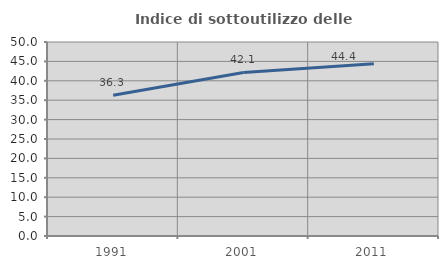
| Category | Indice di sottoutilizzo delle abitazioni  |
|---|---|
| 1991.0 | 36.295 |
| 2001.0 | 42.146 |
| 2011.0 | 44.397 |